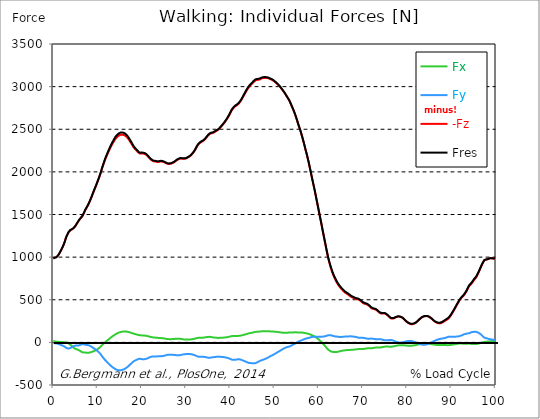
| Category |  Fx |  Fy |  -Fz |  Fres |
|---|---|---|---|---|
| 0.0 | 11.91 | -6.64 | 984.4 | 984.84 |
| 0.167348456675344 | 12.28 | -9.05 | 989.33 | 989.79 |
| 0.334696913350688 | 12.34 | -10.94 | 993.5 | 993.94 |
| 0.5020453700260321 | 10.8 | -11 | 996.22 | 996.67 |
| 0.669393826701376 | 8.96 | -10.71 | 998.66 | 999.15 |
| 0.83674228337672 | 8.33 | -13.58 | 1007.04 | 1007.6 |
| 1.0040907400520642 | 7.22 | -15.82 | 1015.89 | 1016.56 |
| 1.1621420602454444 | 6.18 | -19 | 1027.82 | 1028.62 |
| 1.3294905169207885 | 5.69 | -22.47 | 1041.73 | 1042.65 |
| 1.4968389735961325 | 5.73 | -25.94 | 1056.78 | 1057.83 |
| 1.6641874302714765 | 5.78 | -29.43 | 1073.06 | 1074.24 |
| 1.8315358869468206 | 5.75 | -32.63 | 1089.78 | 1091.08 |
| 1.9988843436221646 | 4.42 | -36.05 | 1107.76 | 1109.21 |
| 2.1662328002975086 | 3.38 | -39.55 | 1126.31 | 1127.92 |
| 2.333581256972853 | 2.27 | -43.2 | 1145.98 | 1147.73 |
| 2.5009297136481967 | 1.75 | -47.88 | 1168.82 | 1170.76 |
| 2.6682781703235405 | 2.02 | -54.92 | 1195.23 | 1197.51 |
| 2.8356266269988843 | 2.01 | -63.13 | 1222.9 | 1225.6 |
| 3.002975083674229 | -0.2 | -67.44 | 1245.37 | 1248.25 |
| 3.1703235403495724 | -4.73 | -69.08 | 1263.28 | 1266.26 |
| 3.337671997024917 | -8.69 | -71.6 | 1280.3 | 1283.44 |
| 3.4957233172182973 | -13.5 | -72.47 | 1295.39 | 1298.62 |
| 3.663071773893641 | -19.99 | -70.06 | 1306.76 | 1309.95 |
| 3.8304202305689854 | -26.94 | -66.25 | 1315.14 | 1318.23 |
| 3.997768687244329 | -35.18 | -60.8 | 1320.66 | 1323.67 |
| 4.165117143919673 | -44.12 | -54.81 | 1324.78 | 1327.78 |
| 4.332465600595017 | -52.69 | -49.46 | 1329.93 | 1333.13 |
| 4.499814057270361 | -60.48 | -45.06 | 1335.81 | 1339.24 |
| 4.667162513945706 | -66.55 | -42.38 | 1344.07 | 1347.79 |
| 4.834510970621049 | -72.58 | -39.12 | 1353.6 | 1357.63 |
| 5.001859427296393 | -76.26 | -37.92 | 1365.9 | 1370.07 |
| 5.169207883971737 | -79.37 | -37.57 | 1379.18 | 1383.47 |
| 5.336556340647081 | -82.12 | -37.87 | 1393.19 | 1397.61 |
| 5.503904797322425 | -85.26 | -37.05 | 1406.78 | 1411.25 |
| 5.671253253997769 | -88.7 | -36.09 | 1421.08 | 1425.6 |
| 5.82930457419115 | -93.6 | -34.37 | 1433.59 | 1438.2 |
| 5.996653030866494 | -98.81 | -31.89 | 1444.83 | 1449.57 |
| 6.164001487541838 | -104.31 | -28.37 | 1455.13 | 1460.06 |
| 6.331349944217181 | -109.92 | -24.55 | 1465.17 | 1470.33 |
| 6.498698400892526 | -114.68 | -20.94 | 1475.22 | 1480.62 |
| 6.66604685756787 | -117.17 | -20.12 | 1489.48 | 1494.98 |
| 6.833395314243213 | -118.01 | -22.51 | 1507.38 | 1512.9 |
| 7.000743770918558 | -118.46 | -25.35 | 1526.02 | 1531.54 |
| 7.168092227593902 | -118.82 | -28.46 | 1545.52 | 1551.02 |
| 7.335440684269246 | -120.25 | -28.81 | 1561.64 | 1567.17 |
| 7.50278914094459 | -120.4 | -29.78 | 1576.9 | 1582.43 |
| 7.6701375976199335 | -120.35 | -31.23 | 1592.76 | 1598.3 |
| 7.837486054295278 | -120.97 | -32.45 | 1609.32 | 1614.89 |
| 7.995537374488658 | -121.09 | -34.19 | 1626.58 | 1632.16 |
| 8.162885831164003 | -119.97 | -37.43 | 1645.41 | 1650.98 |
| 8.330234287839346 | -117.86 | -42 | 1665.44 | 1670.97 |
| 8.49758274451469 | -115.31 | -47.05 | 1686.41 | 1691.88 |
| 8.664931201190035 | -112.24 | -52.37 | 1708.22 | 1713.59 |
| 8.832279657865378 | -108.85 | -58.32 | 1730.59 | 1735.9 |
| 8.999628114540721 | -105.11 | -64.97 | 1753.41 | 1758.72 |
| 9.166976571216066 | -102.48 | -70.4 | 1774.99 | 1780.34 |
| 9.334325027891412 | -98.98 | -76.43 | 1796.69 | 1802.11 |
| 9.501673484566755 | -95.3 | -82.33 | 1818 | 1823.47 |
| 9.669021941242098 | -90.69 | -88.65 | 1839.4 | 1844.94 |
| 9.836370397917442 | -84.93 | -95.78 | 1862.14 | 1867.73 |
| 10.003718854592787 | -79.33 | -102.62 | 1884.9 | 1890.57 |
| 10.17106731126813 | -73.14 | -110.29 | 1907.83 | 1913.66 |
| 10.329118631461512 | -66.72 | -118.26 | 1931.49 | 1937.44 |
| 10.496467088136853 | -59.82 | -127.04 | 1955.51 | 1961.69 |
| 10.663815544812199 | -52.16 | -137 | 1980.76 | 1987.36 |
| 10.831164001487544 | -43.04 | -149.3 | 2008.68 | 2015.88 |
| 10.998512458162887 | -33.3 | -162.63 | 2037.71 | 2045.54 |
| 11.16586091483823 | -24.65 | -173.83 | 2064.16 | 2072.66 |
| 11.333209371513574 | -16.39 | -184.43 | 2089.5 | 2098.66 |
| 11.50055782818892 | -8.19 | -194.67 | 2114.31 | 2124.12 |
| 11.667906284864264 | -0.02 | -204.94 | 2138.26 | 2148.85 |
| 11.835254741539607 | 7.55 | -214.44 | 2160.25 | 2171.64 |
| 12.00260319821495 | 14.55 | -222.96 | 2180.97 | 2193.08 |
| 12.169951654890292 | 21.43 | -231.35 | 2201.13 | 2213.98 |
| 12.337300111565641 | 28.48 | -240.25 | 2220.82 | 2234.52 |
| 12.504648568240984 | 35.56 | -248.93 | 2239.61 | 2254.26 |
| 12.662699888434362 | 42.72 | -257.59 | 2258.37 | 2273.97 |
| 12.830048345109708 | 49.83 | -266.1 | 2277.04 | 2293.59 |
| 12.997396801785053 | 56.8 | -274.43 | 2295.22 | 2312.72 |
| 13.164745258460396 | 63.54 | -282.27 | 2311.97 | 2330.47 |
| 13.33209371513574 | 70.44 | -289.74 | 2327.72 | 2347.26 |
| 13.499442171811083 | 75.85 | -295.33 | 2341.71 | 2362.03 |
| 13.666790628486426 | 81.25 | -300.91 | 2356.05 | 2377.16 |
| 13.834139085161771 | 87.4 | -307.39 | 2371.51 | 2393.52 |
| 14.001487541837117 | 93.24 | -313.08 | 2384.51 | 2407.4 |
| 14.16883599851246 | 98.73 | -318.05 | 2395.52 | 2419.21 |
| 14.336184455187803 | 103.44 | -321.59 | 2404.61 | 2428.91 |
| 14.503532911863147 | 107.65 | -324.21 | 2412.51 | 2437.31 |
| 14.670881368538492 | 111.45 | -326.25 | 2420 | 2445.2 |
| 14.828932688731873 | 115.01 | -327.86 | 2426.94 | 2452.48 |
| 14.996281145407215 | 118.23 | -328.66 | 2431.89 | 2457.68 |
| 15.163629602082558 | 120.7 | -327.8 | 2434.65 | 2460.44 |
| 15.330978058757903 | 122.64 | -325.58 | 2435.99 | 2461.6 |
| 15.498326515433247 | 124.66 | -323.73 | 2436.12 | 2461.6 |
| 15.665674972108594 | 126.19 | -321.33 | 2435.63 | 2460.88 |
| 15.833023428783937 | 127.36 | -318.86 | 2434.58 | 2459.59 |
| 16.00037188545928 | 127.98 | -314.56 | 2431.41 | 2455.94 |
| 16.167720342134626 | 128.03 | -309.93 | 2427.25 | 2451.24 |
| 16.335068798809967 | 127.59 | -304.63 | 2421.1 | 2444.46 |
| 16.502417255485312 | 126.74 | -298.53 | 2413.74 | 2436.34 |
| 16.669765712160658 | 125.36 | -292.03 | 2404.9 | 2426.68 |
| 16.837114168836 | 123.83 | -285.48 | 2395.56 | 2416.52 |
| 17.004462625511344 | 121.59 | -277.66 | 2383.72 | 2403.71 |
| 17.16251394570472 | 119.48 | -269.64 | 2371.1 | 2390.12 |
| 17.32986240238007 | 116.58 | -260.92 | 2356.48 | 2374.47 |
| 17.497210859055414 | 113.6 | -253.19 | 2343.47 | 2360.57 |
| 17.664559315730756 | 110.61 | -244.91 | 2330.14 | 2346.29 |
| 17.8319077724061 | 107.75 | -236.28 | 2315.38 | 2330.57 |
| 17.999256229081443 | 105.07 | -228.48 | 2300.38 | 2314.75 |
| 18.166604685756788 | 102.53 | -222.24 | 2287.42 | 2301.11 |
| 18.333953142432133 | 99.66 | -216.58 | 2275.95 | 2288.98 |
| 18.501301599107478 | 97.17 | -212.51 | 2266.82 | 2279.41 |
| 18.668650055782823 | 94.83 | -207.87 | 2257.31 | 2269.42 |
| 18.835998512458165 | 92.15 | -203.86 | 2248.07 | 2259.73 |
| 19.00334696913351 | 90.05 | -200.41 | 2239.33 | 2250.61 |
| 19.170695425808855 | 88.12 | -197.13 | 2230.41 | 2241.34 |
| 19.338043882484197 | 85.95 | -193.63 | 2221.59 | 2232.16 |
| 19.496095202677576 | 84.13 | -192.21 | 2216.55 | 2226.94 |
| 19.66344365935292 | 83.1 | -192.64 | 2214.68 | 2225.08 |
| 19.830792116028263 | 82.26 | -193.38 | 2213.91 | 2224.35 |
| 19.998140572703612 | 81.87 | -196.41 | 2215.91 | 2226.59 |
| 20.165489029378953 | 81.71 | -198.99 | 2215.91 | 2226.81 |
| 20.3328374860543 | 81.23 | -198.8 | 2213.73 | 2224.6 |
| 20.500185942729644 | 80.58 | -197.67 | 2211.97 | 2222.71 |
| 20.667534399404985 | 79.52 | -196.57 | 2209.75 | 2220.37 |
| 20.83488285608033 | 78.04 | -195.05 | 2205.72 | 2216.17 |
| 21.002231312755672 | 76.58 | -192.94 | 2199.47 | 2209.72 |
| 21.16957976943102 | 75.05 | -189.93 | 2192.65 | 2202.63 |
| 21.336928226106362 | 72.94 | -185.86 | 2183.7 | 2193.32 |
| 21.504276682781704 | 70.34 | -181.1 | 2173.36 | 2182.6 |
| 21.67162513945705 | 68.23 | -177.57 | 2163.78 | 2172.73 |
| 21.82967645965043 | 65.98 | -173.79 | 2154.67 | 2163.27 |
| 21.997024916325774 | 63.77 | -170.45 | 2146.39 | 2154.69 |
| 22.16437337300112 | 61.77 | -168.02 | 2139.14 | 2147.21 |
| 22.33172182967646 | 60.2 | -166.19 | 2132.74 | 2140.66 |
| 22.499070286351806 | 58.53 | -165.67 | 2127.44 | 2135.29 |
| 22.666418743027148 | 57.59 | -165 | 2124.09 | 2131.89 |
| 22.833767199702496 | 56.73 | -164.79 | 2122.69 | 2130.45 |
| 23.00111565637784 | 56.11 | -165.24 | 2122.25 | 2130.01 |
| 23.168464113053183 | 55.4 | -165.29 | 2121.16 | 2128.89 |
| 23.335812569728528 | 54.31 | -164.51 | 2118.43 | 2126.06 |
| 23.50316102640387 | 53.18 | -164.21 | 2115.8 | 2123.37 |
| 23.670509483079215 | 52.7 | -164.11 | 2116.32 | 2123.88 |
| 23.83785793975456 | 52.26 | -164.12 | 2117.46 | 2125 |
| 23.995909259947936 | 52.01 | -164.19 | 2119.54 | 2127.07 |
| 24.163257716623285 | 51.62 | -164.01 | 2121.56 | 2129.06 |
| 24.330606173298627 | 50.5 | -163 | 2122.64 | 2130.02 |
| 24.49795462997397 | 49.5 | -162.12 | 2122.91 | 2130.2 |
| 24.665303086649313 | 48.54 | -160.9 | 2121.08 | 2128.25 |
| 24.83265154332466 | 47.69 | -159.42 | 2117.77 | 2124.82 |
| 25.0 | 46.81 | -157.63 | 2114.32 | 2121.21 |
| 25.167348456675345 | 45.34 | -155.41 | 2110.66 | 2117.39 |
| 25.334696913350694 | 43.54 | -152.9 | 2106.35 | 2112.89 |
| 25.502045370026035 | 41.7 | -150.12 | 2101.45 | 2107.79 |
| 25.669393826701377 | 40.02 | -147.5 | 2096.96 | 2103.11 |
| 25.836742283376722 | 38.9 | -145.52 | 2094.05 | 2100.05 |
| 26.004090740052067 | 38.23 | -144.38 | 2093.16 | 2099.09 |
| 26.17143919672741 | 38.06 | -144.26 | 2093.6 | 2099.54 |
| 26.329490516920792 | 37.8 | -144.18 | 2093.96 | 2099.91 |
| 26.49683897359613 | 37.62 | -144.2 | 2094.74 | 2100.71 |
| 26.66418743027148 | 37.82 | -144.5 | 2097.2 | 2103.2 |
| 26.831535886946828 | 38.28 | -145.21 | 2101.03 | 2107.08 |
| 26.998884343622166 | 38.72 | -145.86 | 2104.91 | 2110.98 |
| 27.166232800297514 | 39.23 | -146.44 | 2108.99 | 2115.09 |
| 27.333581256972852 | 40.02 | -147.18 | 2114.09 | 2120.23 |
| 27.5009297136482 | 40.81 | -147.9 | 2119.79 | 2125.97 |
| 27.668278170323543 | 41.75 | -149.26 | 2127.09 | 2133.36 |
| 27.835626626998888 | 42.63 | -150.69 | 2134.3 | 2140.65 |
| 28.002975083674233 | 43.12 | -151.63 | 2140.14 | 2146.53 |
| 28.170323540349575 | 43.3 | -151.88 | 2144.92 | 2151.3 |
| 28.33767199702492 | 43.24 | -151.97 | 2149.21 | 2155.57 |
| 28.50502045370026 | 42.97 | -151.4 | 2153.09 | 2159.38 |
| 28.663071773893645 | 42.17 | -149.76 | 2155.29 | 2161.43 |
| 28.830420230568986 | 40.99 | -147.76 | 2156.26 | 2162.22 |
| 28.99776868724433 | 39.36 | -145.36 | 2155.44 | 2161.21 |
| 29.165117143919673 | 37.71 | -143.3 | 2154.34 | 2159.94 |
| 29.33246560059502 | 36.14 | -141.6 | 2153.39 | 2158.85 |
| 29.499814057270367 | 34.72 | -140.08 | 2152.97 | 2158.3 |
| 29.66716251394571 | 33.56 | -138.92 | 2153.56 | 2158.78 |
| 29.834510970621054 | 32.68 | -137.94 | 2155.05 | 2160.17 |
| 30.00185942729639 | 32.23 | -137.38 | 2157.78 | 2162.83 |
| 30.169207883971744 | 32.19 | -137.56 | 2161.32 | 2166.36 |
| 30.33655634064708 | 32.29 | -137.57 | 2166.18 | 2171.19 |
| 30.50390479732243 | 32.43 | -137.5 | 2171.29 | 2176.28 |
| 30.671253253997772 | 32.59 | -137.17 | 2176.24 | 2181.2 |
| 30.829304574191156 | 33.21 | -137.45 | 2182.17 | 2187.13 |
| 30.996653030866494 | 33.96 | -137.91 | 2188.39 | 2193.38 |
| 31.164001487541842 | 35.16 | -139.41 | 2196.7 | 2201.79 |
| 31.331349944217187 | 36.61 | -141.06 | 2206.05 | 2211.25 |
| 31.498698400892525 | 38.28 | -143.12 | 2216.44 | 2221.78 |
| 31.666046857567874 | 39.99 | -145.44 | 2227.5 | 2232.99 |
| 31.833395314243212 | 41.74 | -148.04 | 2238.93 | 2244.6 |
| 32.00074377091856 | 43.61 | -151.23 | 2252.94 | 2258.86 |
| 32.1680922275939 | 45.81 | -154.89 | 2267.84 | 2274.04 |
| 32.33544068426925 | 48.56 | -159.7 | 2284.28 | 2290.86 |
| 32.50278914094459 | 50.8 | -163.7 | 2300.11 | 2307.04 |
| 32.670137597619934 | 52.37 | -166.37 | 2313.67 | 2320.84 |
| 32.83748605429528 | 53.48 | -168.16 | 2324.68 | 2331.97 |
| 33.004834510970625 | 54.09 | -168.91 | 2333.27 | 2340.6 |
| 33.162885831164004 | 54.71 | -169.31 | 2340.97 | 2348.31 |
| 33.33023428783935 | 54.95 | -169.37 | 2347.61 | 2354.96 |
| 33.497582744514695 | 55 | -169.36 | 2352.37 | 2359.71 |
| 33.664931201190036 | 55.19 | -169.25 | 2357.08 | 2364.4 |
| 33.83227965786538 | 55.43 | -169.11 | 2361.85 | 2369.15 |
| 33.99962811454073 | 56.08 | -169.59 | 2367.64 | 2374.97 |
| 34.16697657121607 | 57.3 | -170.77 | 2375.01 | 2382.4 |
| 34.33432502789141 | 58.94 | -172.31 | 2384.22 | 2391.72 |
| 34.50167348456676 | 60.63 | -174.06 | 2394.56 | 2402.17 |
| 34.6690219412421 | 62.31 | -176.18 | 2406.52 | 2414.29 |
| 34.83637039791744 | 63.23 | -178.03 | 2417.71 | 2425.61 |
| 35.00371885459279 | 64.2 | -179.68 | 2427.75 | 2435.78 |
| 35.17106731126814 | 64.77 | -180.5 | 2436.3 | 2444.38 |
| 35.338415767943474 | 64.78 | -180.38 | 2443.08 | 2451.11 |
| 35.49646708813686 | 64 | -179.5 | 2447.87 | 2455.8 |
| 35.6638155448122 | 62.68 | -178.07 | 2451.42 | 2459.19 |
| 35.831164001487544 | 61.01 | -176.24 | 2453.87 | 2461.43 |
| 35.998512458162885 | 59.15 | -174.33 | 2455.56 | 2462.92 |
| 36.165860914838234 | 58.2 | -173.71 | 2459.35 | 2466.62 |
| 36.333209371513576 | 57.39 | -173.33 | 2463.85 | 2471.07 |
| 36.50055782818892 | 56.14 | -172.14 | 2468.59 | 2475.68 |
| 36.667906284864266 | 55.39 | -171.01 | 2474.55 | 2481.51 |
| 36.83525474153961 | 54.59 | -169.59 | 2480.28 | 2487.11 |
| 37.002603198214956 | 53.43 | -167.85 | 2484.5 | 2491.17 |
| 37.1699516548903 | 52.61 | -167 | 2489.25 | 2495.85 |
| 37.337300111565646 | 52.32 | -166.99 | 2496.53 | 2503.11 |
| 37.50464856824098 | 52.58 | -167.59 | 2505.04 | 2511.64 |
| 37.66269988843437 | 53.08 | -168.4 | 2514 | 2520.64 |
| 37.83004834510971 | 53.27 | -169.34 | 2523.95 | 2530.63 |
| 37.99739680178505 | 53.92 | -170.53 | 2534.47 | 2541.21 |
| 38.16474525846039 | 54.76 | -171.54 | 2544.39 | 2551.21 |
| 38.33209371513574 | 55.34 | -171.94 | 2554.43 | 2561.26 |
| 38.49944217181109 | 55.85 | -172.4 | 2564.66 | 2571.51 |
| 38.666790628486424 | 56.59 | -173.57 | 2575.49 | 2582.41 |
| 38.83413908516178 | 57.7 | -175.69 | 2587.81 | 2594.85 |
| 39.001487541837115 | 58.63 | -177.64 | 2600.24 | 2607.4 |
| 39.16883599851246 | 59.6 | -179.38 | 2612.91 | 2620.18 |
| 39.336184455187805 | 61.05 | -181.67 | 2626.56 | 2633.97 |
| 39.503532911863154 | 62.82 | -184.36 | 2640.66 | 2648.27 |
| 39.670881368538495 | 64.58 | -187.13 | 2655.29 | 2663.09 |
| 39.83822982521384 | 66.47 | -190.05 | 2670.81 | 2678.8 |
| 39.996281145407224 | 68.98 | -194.49 | 2688.58 | 2696.89 |
| 40.163629602082565 | 71.41 | -198.95 | 2706.31 | 2714.96 |
| 40.33097805875791 | 73.39 | -202.39 | 2721.58 | 2730.49 |
| 40.498326515433256 | 74.57 | -204.29 | 2734.31 | 2743.35 |
| 40.6656749721086 | 74.85 | -204.92 | 2744.83 | 2753.9 |
| 40.83302342878393 | 75.25 | -205.45 | 2754.56 | 2763.64 |
| 41.00037188545929 | 75.04 | -204.9 | 2763.16 | 2772.15 |
| 41.16772034213463 | 75.03 | -204.09 | 2771.11 | 2779.99 |
| 41.33506879880997 | 75.34 | -202.59 | 2776.98 | 2785.73 |
| 41.50241725548531 | 75.27 | -200.54 | 2781.97 | 2790.54 |
| 41.66976571216066 | 75.48 | -198.84 | 2788.4 | 2796.84 |
| 41.837114168836 | 75.91 | -197.96 | 2796.19 | 2804.56 |
| 42.004462625511344 | 76.64 | -198.33 | 2805.83 | 2814.23 |
| 42.17181108218669 | 77.69 | -199.99 | 2817.56 | 2826.07 |
| 42.32986240238007 | 78.94 | -201.89 | 2829.63 | 2838.28 |
| 42.497210859055414 | 80.84 | -204.61 | 2842.92 | 2851.79 |
| 42.66455931573076 | 83.2 | -208.55 | 2858.38 | 2867.54 |
| 42.831907772406105 | 85.61 | -212.22 | 2874.03 | 2883.47 |
| 42.999256229081446 | 87.74 | -215.34 | 2889.29 | 2898.97 |
| 43.16660468575679 | 89.56 | -218.92 | 2904.98 | 2914.92 |
| 43.33395314243214 | 91.98 | -222.73 | 2920.57 | 2930.81 |
| 43.50130159910748 | 94.86 | -226.54 | 2936.44 | 2947 |
| 43.66865005578282 | 97.72 | -230.43 | 2951.88 | 2962.77 |
| 43.83599851245817 | 100.14 | -234.21 | 2965.44 | 2976.64 |
| 44.00334696913351 | 102.66 | -237.74 | 2978.09 | 2989.6 |
| 44.17069542580886 | 105.26 | -240.48 | 2990.34 | 3002.11 |
| 44.3380438824842 | 107.64 | -242.59 | 3001.9 | 3013.89 |
| 44.49609520267758 | 109.36 | -243.71 | 3011.63 | 3023.73 |
| 44.66344365935292 | 110.51 | -243.36 | 3020.22 | 3032.31 |
| 44.83079211602827 | 112.08 | -243.44 | 3029.04 | 3041.17 |
| 44.99814057270361 | 114.17 | -243.92 | 3038.21 | 3050.43 |
| 45.16548902937895 | 116.44 | -244.56 | 3047.71 | 3060.03 |
| 45.332837486054295 | 118.81 | -244.91 | 3056.6 | 3069 |
| 45.500185942729644 | 120.83 | -244.65 | 3064.59 | 3077.02 |
| 45.66753439940499 | 122.85 | -243.68 | 3071.09 | 3083.48 |
| 45.83488285608033 | 124.71 | -241.29 | 3076.04 | 3088.3 |
| 46.00223131275568 | 125.34 | -236.71 | 3078.22 | 3090.14 |
| 46.16957976943102 | 125.37 | -231.79 | 3079.07 | 3090.65 |
| 46.336928226106366 | 125.49 | -226.68 | 3080.02 | 3091.25 |
| 46.50427668278171 | 126.02 | -221.07 | 3081.62 | 3092.51 |
| 46.671625139457056 | 127.17 | -217.78 | 3085.5 | 3096.19 |
| 46.829676459650436 | 128.22 | -214.54 | 3089.2 | 3099.73 |
| 46.99702491632577 | 129.12 | -211.28 | 3093.02 | 3103.37 |
| 47.16437337300112 | 130.05 | -208.3 | 3097.45 | 3107.61 |
| 47.33172182967646 | 130.38 | -204.9 | 3100.57 | 3110.51 |
| 47.49907028635181 | 130.83 | -202.21 | 3101.67 | 3111.48 |
| 47.66641874302716 | 131.01 | -198.94 | 3102.21 | 3111.85 |
| 47.83376719970249 | 130.99 | -195.26 | 3102.59 | 3112.04 |
| 48.001115656377834 | 131.08 | -191.44 | 3102.59 | 3111.82 |
| 48.16846411305319 | 131.06 | -187.56 | 3102.01 | 3110.98 |
| 48.33581256972853 | 130.97 | -183.81 | 3101.2 | 3109.92 |
| 48.50316102640387 | 130.71 | -179.55 | 3099.54 | 3107.98 |
| 48.67050948307921 | 130.26 | -174.45 | 3096.87 | 3104.98 |
| 48.837857939754564 | 129.43 | -168.7 | 3092.94 | 3100.71 |
| 49.005206396429905 | 129.03 | -163.28 | 3089.01 | 3096.48 |
| 49.163257716623285 | 128.93 | -159.63 | 3086.01 | 3093.31 |
| 49.33060617329863 | 128.77 | -156.08 | 3082.64 | 3089.74 |
| 49.49795462997397 | 128.12 | -151.75 | 3077.88 | 3084.73 |
| 49.66530308664932 | 127.11 | -146.84 | 3072.46 | 3079.01 |
| 49.832651543324666 | 126.62 | -142.18 | 3066.59 | 3072.9 |
| 50.0 | 125.87 | -137.25 | 3059.81 | 3065.88 |
| 50.16734845667534 | 125.04 | -132.2 | 3052.66 | 3058.48 |
| 50.33469691335069 | 124.14 | -126.81 | 3045.09 | 3050.65 |
| 50.50204537002604 | 123 | -120.95 | 3036.55 | 3041.82 |
| 50.66939382670139 | 121.55 | -115.96 | 3028.33 | 3033.36 |
| 50.836742283376715 | 120.38 | -110.98 | 3020.84 | 3025.66 |
| 51.00409074005207 | 119.63 | -106.42 | 3012.6 | 3017.26 |
| 51.17143919672741 | 118.47 | -101.42 | 3002.65 | 3007.1 |
| 51.32949051692079 | 116.97 | -96.06 | 2992.02 | 2996.24 |
| 51.496838973596134 | 115.61 | -90.16 | 2981.21 | 2985.19 |
| 51.66418743027148 | 114.61 | -84.97 | 2969.96 | 2973.76 |
| 51.831535886946824 | 113.83 | -80.21 | 2958.31 | 2961.96 |
| 51.99888434362217 | 113.04 | -75.3 | 2946.28 | 2949.75 |
| 52.16623280029752 | 112.28 | -70.37 | 2934.34 | 2937.62 |
| 52.33358125697285 | 111.83 | -66.01 | 2921.65 | 2924.82 |
| 52.5009297136482 | 111.73 | -62.18 | 2908.07 | 2911.19 |
| 52.668278170323546 | 111.61 | -58.23 | 2893.9 | 2896.96 |
| 52.835626626998895 | 111.97 | -54.79 | 2879.61 | 2882.65 |
| 53.00297508367424 | 113.76 | -53.17 | 2866.36 | 2869.45 |
| 53.17032354034958 | 115.35 | -51.6 | 2852.4 | 2855.52 |
| 53.33767199702492 | 116.51 | -49.73 | 2837.06 | 2840.18 |
| 53.50502045370027 | 116.38 | -45.45 | 2818.29 | 2821.32 |
| 53.663071773893655 | 116 | -40.72 | 2798.76 | 2801.72 |
| 53.83042023056899 | 116.04 | -36.19 | 2779.2 | 2782.1 |
| 53.99776868724433 | 116.25 | -31.82 | 2759.17 | 2762.05 |
| 54.16511714391967 | 116.5 | -27.01 | 2738.66 | 2741.51 |
| 54.33246560059503 | 116.84 | -22.33 | 2716.88 | 2719.75 |
| 54.49981405727037 | 117.45 | -18 | 2694.75 | 2697.65 |
| 54.667162513945705 | 118.33 | -13.62 | 2671.9 | 2674.85 |
| 54.834510970621054 | 118.24 | -8.39 | 2646.53 | 2649.49 |
| 55.0018594272964 | 117.43 | -2.77 | 2619.77 | 2622.73 |
| 55.169207883971744 | 116.44 | 2.47 | 2592.87 | 2595.83 |
| 55.336556340647086 | 115.34 | 7.52 | 2564.99 | 2567.95 |
| 55.50390479732243 | 114.64 | 12.16 | 2537.08 | 2540.04 |
| 55.671253253997776 | 115.05 | 15.05 | 2511.84 | 2514.82 |
| 55.83860171067312 | 115.57 | 17.26 | 2486.48 | 2489.5 |
| 55.9966530308665 | 115.4 | 20.86 | 2457.69 | 2460.77 |
| 56.16400148754184 | 114.98 | 24.77 | 2427.87 | 2431 |
| 56.33134994421718 | 114.32 | 28.49 | 2396.83 | 2400.03 |
| 56.498698400892536 | 112.91 | 32.29 | 2364.77 | 2368.01 |
| 56.66604685756788 | 111.23 | 36.06 | 2331.3 | 2334.56 |
| 56.83339531424321 | 109.5 | 39.53 | 2297.22 | 2300.49 |
| 57.00074377091856 | 108.01 | 42.45 | 2263.54 | 2266.82 |
| 57.16809222759391 | 106.58 | 45.13 | 2229.9 | 2233.2 |
| 57.33544068426925 | 105.06 | 47.09 | 2195.73 | 2199.05 |
| 57.5027891409446 | 103.1 | 48.95 | 2160.76 | 2164.08 |
| 57.670137597619934 | 100.68 | 51.11 | 2124.62 | 2127.93 |
| 57.83748605429528 | 97.63 | 53.72 | 2085.67 | 2088.96 |
| 58.004834510970625 | 94.23 | 56.8 | 2044.98 | 2048.26 |
| 58.16288583116401 | 90.67 | 59.94 | 2003.95 | 2007.22 |
| 58.330234287839346 | 87.2 | 61.71 | 1963.57 | 1966.81 |
| 58.497582744514695 | 83.49 | 63.32 | 1922.73 | 1925.92 |
| 58.66493120119004 | 79.66 | 64.69 | 1882.21 | 1885.32 |
| 58.832279657865385 | 75.88 | 65.37 | 1843.09 | 1846.14 |
| 58.999628114540734 | 71.42 | 65.34 | 1803.21 | 1806.14 |
| 59.16697657121607 | 66.34 | 65.44 | 1761.94 | 1764.75 |
| 59.33432502789142 | 60.68 | 65.83 | 1719.56 | 1722.26 |
| 59.50167348456676 | 54.76 | 66.36 | 1676.6 | 1679.19 |
| 59.66902194124211 | 48.72 | 67.02 | 1633.16 | 1635.65 |
| 59.83637039791745 | 41.97 | 67.24 | 1589.52 | 1591.89 |
| 60.00371885459278 | 34.16 | 67.19 | 1545.58 | 1547.87 |
| 60.17106731126813 | 26.33 | 67.03 | 1502.43 | 1504.65 |
| 60.33841576794349 | 18.13 | 66.87 | 1458.98 | 1461.17 |
| 60.49646708813685 | 9.43 | 66.59 | 1415.34 | 1417.52 |
| 60.6638155448122 | 1.11 | 66.52 | 1372.45 | 1374.67 |
| 60.831164001487544 | -7.98 | 67.14 | 1328.37 | 1330.71 |
| 60.99851245816289 | -17.33 | 68.03 | 1283.74 | 1286.29 |
| 61.16586091483824 | -26.74 | 69.21 | 1240.85 | 1243.88 |
| 61.333209371513576 | -36.85 | 71.03 | 1196.66 | 1200.34 |
| 61.50055782818892 | -47.16 | 73.11 | 1152.27 | 1156.68 |
| 61.667906284864266 | -57.72 | 75.49 | 1107.87 | 1113.12 |
| 61.835254741539615 | -67.87 | 78.76 | 1064.87 | 1071.12 |
| 62.002603198214956 | -77.8 | 81.68 | 1022.45 | 1029.89 |
| 62.16995165489029 | -86.07 | 82.94 | 983.52 | 992.05 |
| 62.33730011156564 | -92.87 | 83.79 | 948.51 | 957.99 |
| 62.504648568240995 | -98.86 | 84.26 | 915.99 | 926.28 |
| 62.67199702491633 | -103.64 | 83.63 | 885.92 | 897.04 |
| 62.83004834510971 | -107.52 | 82.46 | 857.56 | 869.4 |
| 62.99739680178505 | -110.33 | 80.17 | 830.23 | 842.53 |
| 63.1647452584604 | -111.64 | 77.17 | 806.68 | 819.18 |
| 63.33209371513575 | -112.55 | 74.44 | 784.78 | 797.44 |
| 63.4994421718111 | -113.02 | 72 | 764.74 | 777.53 |
| 63.666790628486424 | -113.23 | 70.64 | 746.17 | 759.13 |
| 63.83413908516177 | -113.22 | 69.44 | 728.3 | 741.38 |
| 64.00148754183712 | -113.22 | 68.72 | 710.62 | 723.88 |
| 64.16883599851248 | -112.04 | 67.15 | 695.34 | 708.5 |
| 64.3361844551878 | -110.13 | 66.08 | 682.12 | 695.13 |
| 64.50353291186315 | -107.97 | 64.4 | 669.11 | 681.87 |
| 64.6708813685385 | -105.97 | 64.21 | 656.37 | 669.04 |
| 64.83822982521384 | -103.78 | 64.03 | 645.04 | 657.54 |
| 65.00557828188919 | -101.55 | 64.02 | 634.89 | 647.17 |
| 65.16362960208257 | -99.58 | 64.17 | 625.15 | 637.23 |
| 65.3309780587579 | -97.83 | 64.65 | 615.69 | 627.66 |
| 65.49832651543326 | -96.3 | 65.16 | 606.63 | 618.54 |
| 65.6656749721086 | -95.14 | 66.73 | 598.11 | 610.05 |
| 65.83302342878395 | -93.82 | 67.73 | 590.16 | 602.09 |
| 66.00037188545929 | -92.41 | 68.27 | 582.84 | 594.72 |
| 66.16772034213463 | -91.01 | 68.1 | 577.03 | 588.76 |
| 66.33506879880998 | -90.07 | 68.57 | 571.87 | 583.58 |
| 66.50241725548531 | -89.22 | 69.16 | 566.84 | 578.55 |
| 66.66976571216065 | -88.65 | 69.65 | 560.5 | 572.28 |
| 66.83711416883601 | -88.66 | 70.06 | 553.59 | 565.51 |
| 67.00446262551135 | -88.74 | 70.71 | 546.25 | 558.38 |
| 67.1718110821867 | -88.35 | 70.83 | 540.01 | 552.2 |
| 67.32986240238007 | -87.81 | 70.6 | 534.46 | 546.62 |
| 67.49721085905541 | -86.85 | 70.25 | 529.87 | 541.91 |
| 67.66455931573076 | -86.1 | 68.94 | 526 | 537.88 |
| 67.83190777240611 | -85.55 | 67.72 | 521.84 | 533.6 |
| 67.99925622908145 | -85.01 | 66.65 | 517.53 | 529.18 |
| 68.16660468575678 | -84.28 | 65.87 | 513.23 | 524.74 |
| 68.33395314243214 | -83.42 | 64.9 | 509.35 | 520.68 |
| 68.50130159910749 | -82.02 | 62.37 | 507.7 | 518.49 |
| 68.66865005578282 | -80.64 | 59.68 | 506.63 | 516.86 |
| 68.83599851245816 | -79.34 | 57.06 | 505.74 | 515.43 |
| 69.00334696913352 | -78.46 | 55.07 | 502.67 | 512.05 |
| 69.17069542580886 | -77.94 | 54.04 | 497.6 | 506.87 |
| 69.3380438824842 | -77.93 | 53.16 | 491.58 | 500.85 |
| 69.50539233915956 | -77.81 | 52.56 | 485.17 | 494.46 |
| 69.66344365935292 | -77.8 | 52.92 | 477.41 | 486.86 |
| 69.83079211602826 | -77.81 | 53.41 | 469.52 | 479.12 |
| 69.99814057270362 | -77.61 | 53.52 | 462.32 | 472.03 |
| 70.16548902937896 | -76.95 | 52.64 | 456.96 | 466.57 |
| 70.33283748605429 | -75.62 | 50.83 | 453.9 | 463.16 |
| 70.50018594272964 | -73.85 | 48.85 | 451.97 | 460.77 |
| 70.667534399405 | -72.08 | 46.78 | 450.11 | 458.46 |
| 70.83488285608033 | -70.64 | 45.1 | 447.25 | 455.26 |
| 71.00223131275568 | -69.6 | 43.78 | 443.03 | 450.83 |
| 71.16957976943102 | -68.86 | 43.09 | 437.3 | 445.03 |
| 71.33692822610637 | -68.55 | 43.15 | 430.28 | 438.11 |
| 71.50427668278171 | -68.58 | 43.49 | 422.23 | 430.26 |
| 71.67162513945706 | -68.63 | 43.92 | 414 | 422.25 |
| 71.8389735961324 | -68.63 | 44.26 | 406 | 414.44 |
| 71.99702491632577 | -68.3 | 44.18 | 399.03 | 407.54 |
| 72.16437337300113 | -67.43 | 43.34 | 394.39 | 402.75 |
| 72.33172182967647 | -65.86 | 41.93 | 392.16 | 400.16 |
| 72.49907028635181 | -64.25 | 40.43 | 390.14 | 397.74 |
| 72.66641874302715 | -62.66 | 39.02 | 388.05 | 395.29 |
| 72.8337671997025 | -61.07 | 37.67 | 385.98 | 392.87 |
| 73.00111565637783 | -59.95 | 36.64 | 382.3 | 388.97 |
| 73.16846411305319 | -59.78 | 36.77 | 375.17 | 381.97 |
| 73.33581256972853 | -59.82 | 37.16 | 367.36 | 374.38 |
| 73.50316102640387 | -59.87 | 37.75 | 359.25 | 366.49 |
| 73.67050948307921 | -59.89 | 38.37 | 351.34 | 358.78 |
| 73.83785793975457 | -59.85 | 38.62 | 344.07 | 351.67 |
| 74.00520639642991 | -59.25 | 37.43 | 339.99 | 347.45 |
| 74.16325771662328 | -57.83 | 35.45 | 338.7 | 345.79 |
| 74.33060617329863 | -56.16 | 32.96 | 338.81 | 345.4 |
| 74.49795462997398 | -54.46 | 30.48 | 338.93 | 345.02 |
| 74.66530308664932 | -52.68 | 27.6 | 339.75 | 345.27 |
| 74.83265154332466 | -50.96 | 25.09 | 340.04 | 345.05 |
| 75.00000000000001 | -49.82 | 23.93 | 337.93 | 342.71 |
| 75.16734845667534 | -49.24 | 23.59 | 333.85 | 338.6 |
| 75.3346969133507 | -49.09 | 23.96 | 327.63 | 332.49 |
| 75.50204537002605 | -49.09 | 24.48 | 320.21 | 325.27 |
| 75.66939382670138 | -49.29 | 25.02 | 312.23 | 317.54 |
| 75.83674228337672 | -49.68 | 25.88 | 303.85 | 309.47 |
| 76.00409074005208 | -50.56 | 27.59 | 293.87 | 300.1 |
| 76.17143919672742 | -50.91 | 28.28 | 286.29 | 292.82 |
| 76.33878765340276 | -50.9 | 28.02 | 281.09 | 287.78 |
| 76.49683897359614 | -50.32 | 26.48 | 278.97 | 285.62 |
| 76.66418743027148 | -49.18 | 23.96 | 278.46 | 284.72 |
| 76.83153588694682 | -47.79 | 21.08 | 278.98 | 284.7 |
| 76.99888434362218 | -46.04 | 17.5 | 281.85 | 286.76 |
| 77.16623280029752 | -44.15 | 13.86 | 286.48 | 290.86 |
| 77.33358125697285 | -42.02 | 10.02 | 292.33 | 296.17 |
| 77.5009297136482 | -40.14 | 7.02 | 295.77 | 299.22 |
| 77.66827817032356 | -38.49 | 4.42 | 299.04 | 302.22 |
| 77.83562662699889 | -36.82 | 1.74 | 301.43 | 304.3 |
| 78.00297508367423 | -35.17 | -0.75 | 303.3 | 305.87 |
| 78.17032354034959 | -34.15 | -1.88 | 303.97 | 306.36 |
| 78.33767199702493 | -33.71 | -1.75 | 301.43 | 303.75 |
| 78.50502045370027 | -33.23 | -1.81 | 298.88 | 301.13 |
| 78.67236891037561 | -32.83 | -1.71 | 296.09 | 298.28 |
| 78.83042023056899 | -32.8 | -0.92 | 292.22 | 294.41 |
| 78.99776868724433 | -33.14 | 0.6 | 286.08 | 288.36 |
| 79.16511714391969 | -33.79 | 2.73 | 278.01 | 280.47 |
| 79.33246560059503 | -34.59 | 4.99 | 269.13 | 271.85 |
| 79.49981405727036 | -35.62 | 7.81 | 260.1 | 263.1 |
| 79.66716251394571 | -36.73 | 10.58 | 251.23 | 254.46 |
| 79.83451097062107 | -37.64 | 12.68 | 243.21 | 246.68 |
| 80.00185942729641 | -38.37 | 14.18 | 236.02 | 239.77 |
| 80.16920788397174 | -38.85 | 15.04 | 229.71 | 233.73 |
| 80.33655634064709 | -39.25 | 15.67 | 224.29 | 228.57 |
| 80.50390479732243 | -39.48 | 15.97 | 219.98 | 224.43 |
| 80.67125325399778 | -39.6 | 16.04 | 216.61 | 221.2 |
| 80.83860171067312 | -39.73 | 16.19 | 213.44 | 218.19 |
| 80.99665303086651 | -39.3 | 15.38 | 211.93 | 216.62 |
| 81.16400148754184 | -38.53 | 13.7 | 212.57 | 217.04 |
| 81.3313499442172 | -37.2 | 11.09 | 215.4 | 219.47 |
| 81.49869840089255 | -35.78 | 8.12 | 218.3 | 222 |
| 81.66604685756786 | -34.37 | 4.98 | 222.02 | 225.36 |
| 81.83339531424322 | -33.02 | 1.89 | 226.43 | 229.42 |
| 82.00074377091858 | -31.11 | -1.97 | 232.54 | 234.99 |
| 82.16809222759392 | -29.12 | -5.56 | 239.37 | 241.53 |
| 82.33544068426926 | -27.03 | -9.09 | 247.72 | 249.82 |
| 82.50278914094459 | -24.88 | -12.74 | 256.64 | 258.76 |
| 82.67013759761994 | -22.78 | -16.13 | 264.45 | 266.55 |
| 82.83748605429528 | -20.71 | -19.46 | 272.12 | 274.24 |
| 83.00483451097062 | -18.8 | -22.23 | 280.54 | 282.72 |
| 83.17218296764597 | -16.85 | -25.08 | 288.17 | 290.38 |
| 83.33023428783935 | -15.63 | -26.46 | 293.68 | 295.92 |
| 83.4975827445147 | -14.69 | -27.3 | 298.68 | 300.98 |
| 83.66493120119004 | -14.01 | -27.44 | 302.68 | 305.02 |
| 83.83227965786537 | -13.49 | -27.33 | 305.61 | 307.95 |
| 83.99962811454073 | -13.16 | -26.98 | 307.6 | 309.94 |
| 84.16697657121607 | -13.07 | -26.1 | 308.32 | 310.69 |
| 84.33432502789142 | -13.15 | -24.9 | 308.18 | 310.55 |
| 84.50167348456677 | -13.44 | -23.22 | 307.66 | 309.95 |
| 84.6690219412421 | -14.04 | -20.46 | 305.82 | 308.08 |
| 84.83637039791745 | -14.71 | -17.51 | 302.41 | 304.55 |
| 85.0037188545928 | -15.83 | -13.66 | 297.97 | 299.92 |
| 85.17106731126813 | -17.22 | -9.31 | 292.88 | 294.7 |
| 85.33841576794349 | -18.85 | -4.63 | 286.6 | 288.56 |
| 85.50576422461883 | -20.27 | -0.4 | 279.56 | 281.53 |
| 85.66381554481221 | -21.82 | 4.22 | 271.84 | 274.06 |
| 85.83116400148755 | -23.47 | 8.92 | 263.21 | 265.66 |
| 85.99851245816289 | -24.94 | 13.06 | 255.15 | 257.82 |
| 86.16586091483823 | -26.37 | 17.25 | 247.59 | 250.52 |
| 86.33320937151358 | -27.48 | 20.88 | 241.67 | 245.08 |
| 86.50055782818893 | -28.52 | 24.58 | 236.36 | 240.49 |
| 86.66790628486427 | -29.62 | 28.59 | 231.34 | 236.24 |
| 86.83525474153961 | -30.57 | 32.29 | 227.51 | 233.14 |
| 87.00260319821496 | -31.33 | 35.26 | 225.04 | 231.45 |
| 87.16995165489031 | -31.77 | 37.73 | 223.59 | 230.68 |
| 87.33730011156564 | -32.11 | 39.94 | 222.71 | 230.4 |
| 87.504648568241 | -32.38 | 41.75 | 223.11 | 231.27 |
| 87.67199702491634 | -32.3 | 43.41 | 225.74 | 234.32 |
| 87.83004834510972 | -32.09 | 44.72 | 229.76 | 238.65 |
| 87.99739680178506 | -31.69 | 45.63 | 234.61 | 243.73 |
| 88.1647452584604 | -31.28 | 46.55 | 239.47 | 248.82 |
| 88.33209371513574 | -30.88 | 48.3 | 245.45 | 254.89 |
| 88.49944217181108 | -31.03 | 50.87 | 250.58 | 260.07 |
| 88.66679062848644 | -30.99 | 53.34 | 256.82 | 266.34 |
| 88.83413908516178 | -31.41 | 56.53 | 262.36 | 272.1 |
| 89.00148754183712 | -32.3 | 60.4 | 266.82 | 276.99 |
| 89.16883599851246 | -32.67 | 63.21 | 272.69 | 283.25 |
| 89.33618445518782 | -32.72 | 65.5 | 279.47 | 290.26 |
| 89.50353291186315 | -32.05 | 66.59 | 288.29 | 298.98 |
| 89.6708813685385 | -30.9 | 66.93 | 299.29 | 309.64 |
| 89.83822982521386 | -29.56 | 66.92 | 312.21 | 322.05 |
| 90.00557828188919 | -28.27 | 66.88 | 326.07 | 335.37 |
| 90.16362960208257 | -26.87 | 66.57 | 340.44 | 349.17 |
| 90.3309780587579 | -25.53 | 66.47 | 355.81 | 363.88 |
| 90.49832651543326 | -24.27 | 66.6 | 370.68 | 378.23 |
| 90.66567497210859 | -22.96 | 66.88 | 385.47 | 392.6 |
| 90.83302342878395 | -21.31 | 67.04 | 401.28 | 408.04 |
| 91.00037188545929 | -19.83 | 67.43 | 417.22 | 423.7 |
| 91.16772034213463 | -18.3 | 67.67 | 433.63 | 439.79 |
| 91.33506879880998 | -16.9 | 68.41 | 449.47 | 455.39 |
| 91.50241725548533 | -15.49 | 69.51 | 464.52 | 470.38 |
| 91.66976571216065 | -14.18 | 71 | 479.2 | 485.07 |
| 91.83711416883601 | -13.54 | 73.28 | 493.16 | 499.21 |
| 92.00446262551137 | -13.25 | 76.05 | 505.6 | 511.95 |
| 92.1718110821867 | -13.4 | 79.24 | 516.76 | 523.49 |
| 92.33915953886203 | -13.44 | 82.49 | 526.06 | 533.17 |
| 92.49721085905541 | -14.27 | 86.7 | 534.36 | 541.99 |
| 92.66455931573077 | -15.38 | 91.23 | 542.45 | 550.64 |
| 92.83190777240611 | -15.74 | 94.29 | 552.82 | 561.36 |
| 92.99925622908145 | -15.87 | 96.69 | 564.73 | 573.5 |
| 93.1666046857568 | -16.12 | 99.2 | 577.94 | 586.97 |
| 93.33395314243214 | -16.06 | 101.44 | 591.7 | 600.92 |
| 93.50130159910749 | -16.19 | 103.83 | 606.86 | 616.28 |
| 93.66865005578283 | -15.7 | 104.9 | 624.83 | 634.19 |
| 93.83599851245818 | -14.22 | 104.95 | 643.43 | 652.69 |
| 94.00334696913353 | -13.76 | 106.32 | 659.57 | 668.92 |
| 94.17069542580886 | -15.23 | 110.32 | 670.48 | 680.36 |
| 94.3380438824842 | -17.01 | 114.94 | 677.72 | 688.34 |
| 94.50539233915954 | -18.77 | 119.52 | 684.76 | 696.12 |
| 94.66344365935292 | -19.58 | 122.24 | 696.36 | 708.05 |
| 94.83079211602828 | -19.36 | 122.42 | 709.72 | 721.25 |
| 94.99814057270362 | -19.54 | 123.08 | 723.05 | 734.48 |
| 95.16548902937897 | -19.46 | 123.32 | 735.59 | 746.83 |
| 95.33283748605432 | -19.61 | 123.71 | 744.95 | 756.08 |
| 95.50018594272963 | -19.75 | 124.09 | 754.31 | 765.33 |
| 95.66753439940499 | -19.25 | 122.96 | 768.02 | 778.71 |
| 95.83488285608034 | -17.84 | 119.55 | 784.87 | 794.97 |
| 96.00223131275567 | -16.19 | 115.97 | 803.32 | 812.72 |
| 96.16957976943102 | -14.08 | 111.64 | 821.85 | 830.51 |
| 96.33692822610638 | -11.61 | 106.18 | 842.04 | 849.94 |
| 96.50427668278171 | -8.95 | 99.68 | 862.31 | 869.37 |
| 96.67162513945706 | -6.27 | 93.02 | 882.52 | 888.71 |
| 96.8389735961324 | -3.47 | 84.94 | 902.15 | 907.53 |
| 96.99702491632577 | -0.68 | 76.37 | 920.95 | 925.58 |
| 97.16437337300111 | 1.84 | 67.84 | 936.99 | 941.04 |
| 97.33172182967647 | 4.27 | 59.46 | 952.26 | 955.73 |
| 97.49907028635181 | 6.11 | 53.02 | 964.89 | 967.89 |
| 97.66641874302715 | 7.04 | 50.84 | 966.88 | 969.64 |
| 97.8337671997025 | 7.72 | 49.07 | 970.03 | 972.58 |
| 98.00111565637785 | 8.56 | 47.46 | 972.44 | 974.75 |
| 98.16846411305319 | 9.41 | 45.74 | 974.38 | 976.49 |
| 98.33581256972855 | 10.35 | 42.4 | 979.36 | 981.19 |
| 98.50316102640389 | 11.01 | 40.6 | 981.74 | 983.41 |
| 98.67050948307921 | 12 | 38.09 | 985.05 | 986.57 |
| 98.83785793975456 | 12.79 | 35.81 | 987.29 | 988.68 |
| 99.0052063964299 | 13.25 | 33.79 | 988.13 | 989.41 |
| 99.17255485310525 | 13.07 | 32.66 | 986.32 | 987.53 |
| 99.33060617329863 | 12.56 | 32.06 | 983.1 | 984.25 |
| 99.49795462997399 | 12.35 | 30.47 | 982.83 | 983.88 |
| 99.66530308664933 | 12.43 | 28.06 | 984.45 | 985.38 |
| 99.83265154332467 | 12.78 | 25.18 | 986.9 | 987.69 |
| 100.0 | 13.24 | 22.2 | 989.56 | 990.2 |